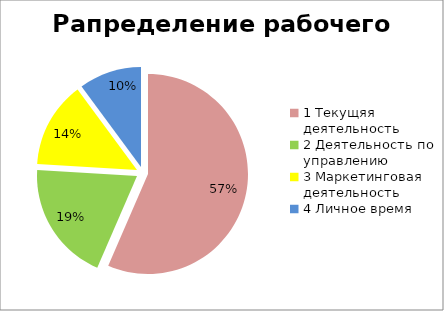
| Category | Series 0 |
|---|---|
| 0 | 1900-01-01 12:10:00 |
| 1 | 0.518 |
| 2 | 0.372 |
| 3 | 0.27 |